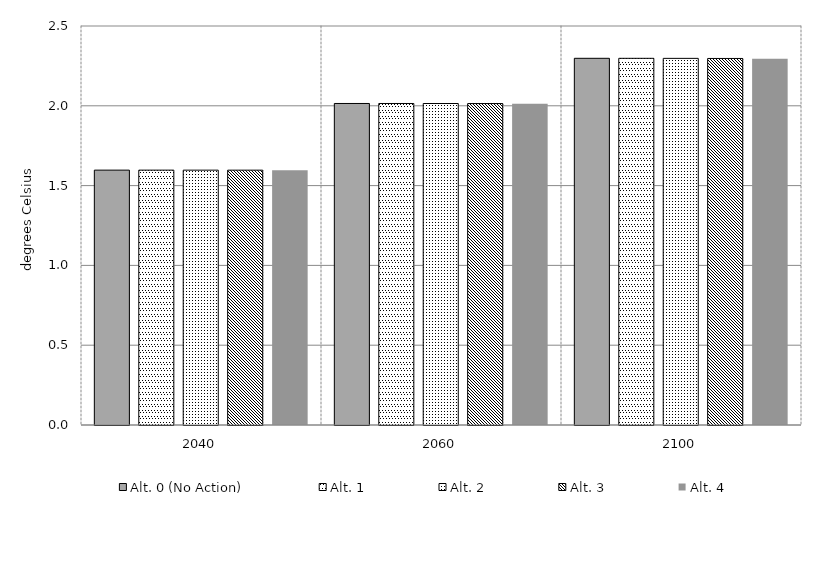
| Category | Alt. 0 (No Action) | Alt. 1 | Alt. 2 | Alt. 3 | Alt. 4 | Alt 5 | Alt 6 | Alt 7 | Alt 8 | Alt 10 |
|---|---|---|---|---|---|---|---|---|---|---|
| 2040.0 | 1.597 | 1.597 | 1.597 | 1.597 | 1.596 |  |  |  |  |  |
| 2060.0 | 2.015 | 2.014 | 2.014 | 2.014 | 2.013 |  |  |  |  |  |
| 2100.0 | 2.298 | 2.297 | 2.297 | 2.297 | 2.295 |  |  |  |  |  |